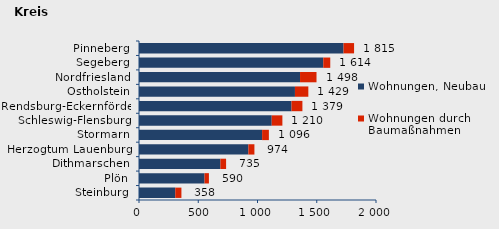
| Category | Wohnungen, Neubau | Wohnungen durch Baumaßnahmen | Series 2 |
|---|---|---|---|
| Steinburg | 306 | 52 | 358 |
| Plön | 553 | 37 | 590 |
| Dithmarschen | 687 | 48 | 735 |
| Herzogtum Lauenburg | 923 | 51 | 974 |
| Stormarn | 1039 | 57 | 1096 |
| Schleswig-Flensburg | 1120 | 90 | 1210 |
| Rendsburg-Eckernförde | 1287 | 92 | 1379 |
| Ostholstein | 1316 | 113 | 1429 |
| Nordfriesland | 1359 | 139 | 1498 |
| Segeberg | 1555 | 59 | 1614 |
| Pinneberg | 1726 | 89 | 1815 |